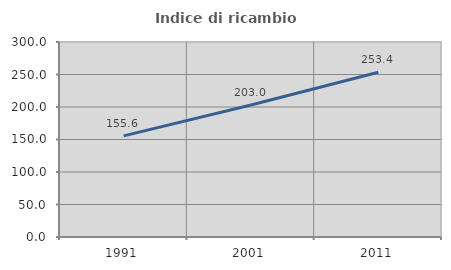
| Category | Indice di ricambio occupazionale  |
|---|---|
| 1991.0 | 155.556 |
| 2001.0 | 203.03 |
| 2011.0 | 253.409 |